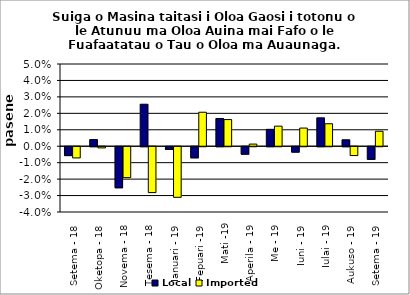
| Category | Local | Imported |
|---|---|---|
| Setema - 18 | -0.005 | -0.007 |
| Oketopa - 18 | 0.004 | -0.001 |
| Novema - 18 | -0.025 | -0.019 |
| Tesema - 18 | 0.026 | -0.028 |
| Ianuari - 19 | -0.002 | -0.031 |
| Fepuari -19 | -0.007 | 0.021 |
| Mati -19 | 0.017 | 0.016 |
| Aperila - 19 | -0.005 | 0.001 |
| Me - 19 | 0.01 | 0.012 |
| Iuni - 19 | -0.003 | 0.011 |
| Iulai - 19 | 0.017 | 0.014 |
| Aukuso - 19 | 0.004 | -0.005 |
| Setema - 19 | -0.008 | 0.009 |